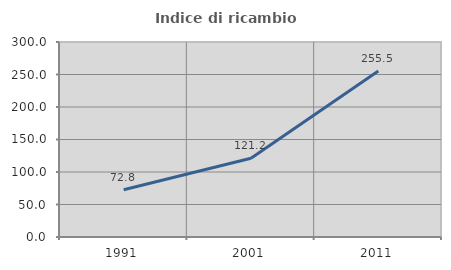
| Category | Indice di ricambio occupazionale  |
|---|---|
| 1991.0 | 72.812 |
| 2001.0 | 121.168 |
| 2011.0 | 255.497 |